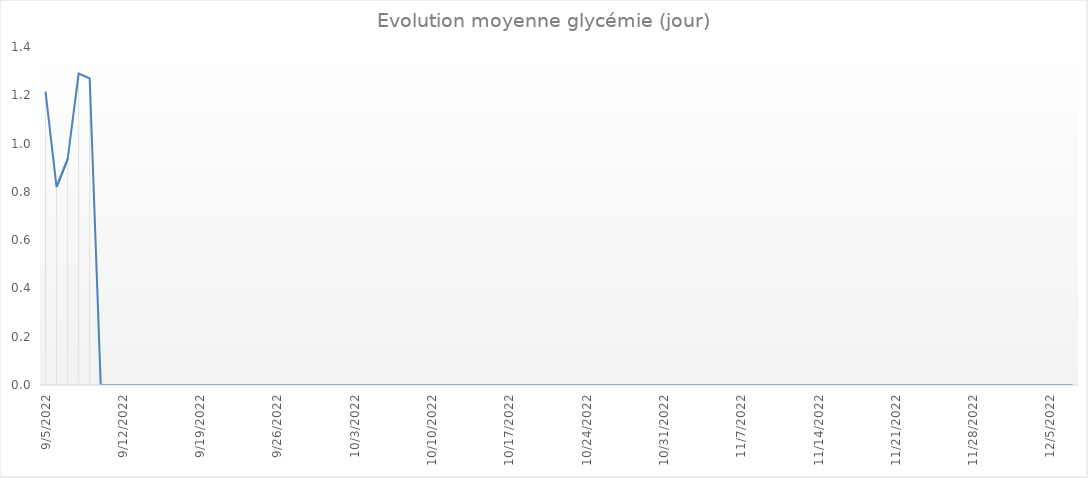
| Category | Series 0 |
|---|---|
| 9/5/22 | 1.215 |
| 9/6/22 | 0.82 |
| 9/7/22 | 0.935 |
| 9/8/22 | 1.29 |
| 9/9/22 | 1.27 |
| 9/10/22 | 0 |
| 9/11/22 | 0 |
| 9/12/22 | 0 |
| 9/13/22 | 0 |
| 9/14/22 | 0 |
| 9/15/22 | 0 |
| 9/16/22 | 0 |
| 9/17/22 | 0 |
| 9/18/22 | 0 |
| 9/19/22 | 0 |
| 9/20/22 | 0 |
| 9/21/22 | 0 |
| 9/22/22 | 0 |
| 9/23/22 | 0 |
| 9/24/22 | 0 |
| 9/25/22 | 0 |
| 9/26/22 | 0 |
| 9/27/22 | 0 |
| 9/28/22 | 0 |
| 9/29/22 | 0 |
| 9/30/22 | 0 |
| 10/1/22 | 0 |
| 10/2/22 | 0 |
| 10/3/22 | 0 |
| 10/4/22 | 0 |
| 10/5/22 | 0 |
| 10/6/22 | 0 |
| 10/7/22 | 0 |
| 10/8/22 | 0 |
| 10/9/22 | 0 |
| 10/10/22 | 0 |
| 10/11/22 | 0 |
| 10/12/22 | 0 |
| 10/13/22 | 0 |
| 10/14/22 | 0 |
| 10/15/22 | 0 |
| 10/16/22 | 0 |
| 10/17/22 | 0 |
| 10/18/22 | 0 |
| 10/19/22 | 0 |
| 10/20/22 | 0 |
| 10/21/22 | 0 |
| 10/22/22 | 0 |
| 10/23/22 | 0 |
| 10/24/22 | 0 |
| 10/25/22 | 0 |
| 10/26/22 | 0 |
| 10/27/22 | 0 |
| 10/28/22 | 0 |
| 10/29/22 | 0 |
| 10/30/22 | 0 |
| 10/31/22 | 0 |
| 11/1/22 | 0 |
| 11/2/22 | 0 |
| 11/3/22 | 0 |
| 11/4/22 | 0 |
| 11/5/22 | 0 |
| 11/6/22 | 0 |
| 11/7/22 | 0 |
| 11/8/22 | 0 |
| 11/9/22 | 0 |
| 11/10/22 | 0 |
| 11/11/22 | 0 |
| 11/12/22 | 0 |
| 11/13/22 | 0 |
| 11/14/22 | 0 |
| 11/15/22 | 0 |
| 11/16/22 | 0 |
| 11/17/22 | 0 |
| 11/18/22 | 0 |
| 11/19/22 | 0 |
| 11/20/22 | 0 |
| 11/21/22 | 0 |
| 11/22/22 | 0 |
| 11/23/22 | 0 |
| 11/24/22 | 0 |
| 11/25/22 | 0 |
| 11/26/22 | 0 |
| 11/27/22 | 0 |
| 11/28/22 | 0 |
| 11/29/22 | 0 |
| 11/30/22 | 0 |
| 12/1/22 | 0 |
| 12/2/22 | 0 |
| 12/3/22 | 0 |
| 12/4/22 | 0 |
| 12/5/22 | 0 |
| 12/6/22 | 0 |
| 12/7/22 | 0 |